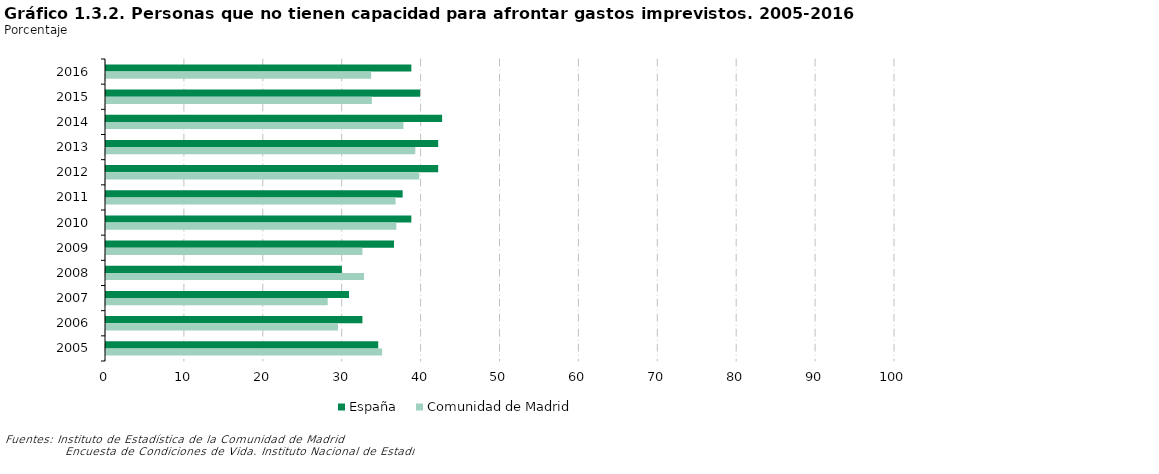
| Category | España | Comunidad de Madrid |
|---|---|---|
| 2016 | 38.7 | 33.6 |
| 2015 | 39.8 | 33.7 |
| 2014 | 42.6 | 37.7 |
| 2013 | 42.1 | 39.2 |
| 2012 | 42.1 | 39.7 |
| 2011 | 37.6 | 36.7 |
| 2010 | 38.7 | 36.8 |
| 2009 | 36.5 | 32.5 |
| 2008 | 29.9 | 32.7 |
| 2007 | 30.8 | 28.1 |
| 2006 | 32.5 | 29.4 |
| 2005 | 34.5 | 35 |